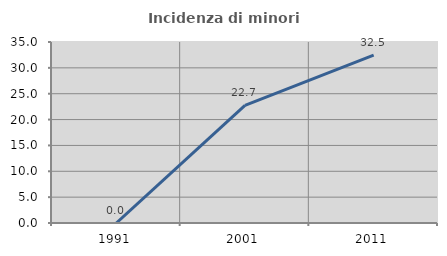
| Category | Incidenza di minori stranieri |
|---|---|
| 1991.0 | 0 |
| 2001.0 | 22.727 |
| 2011.0 | 32.45 |